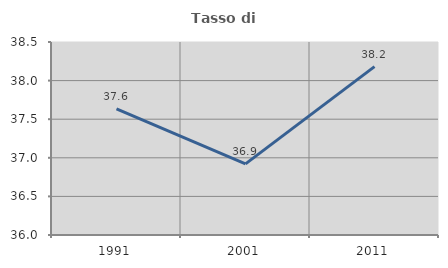
| Category | Tasso di occupazione   |
|---|---|
| 1991.0 | 37.633 |
| 2001.0 | 36.921 |
| 2011.0 | 38.18 |